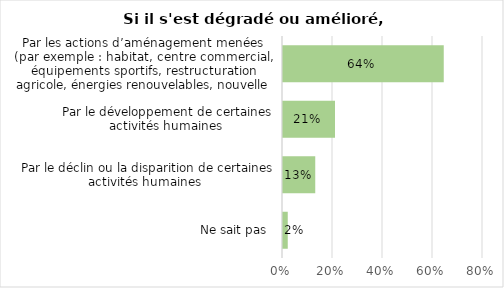
| Category | Series 0 |
|---|---|
| Ne sait pas  | 0.019 |
| Par le déclin ou la disparition de certaines activités humaines  | 0.129 |
| Par le développement de certaines activités humaines  | 0.208 |
| Par les actions d’aménagement menées (par exemple : habitat, centre commercial, équipements sportifs, restructuration agricole, énergies renouvelables, nouvelle route, plantations, etc.) (A1) | 0.643 |